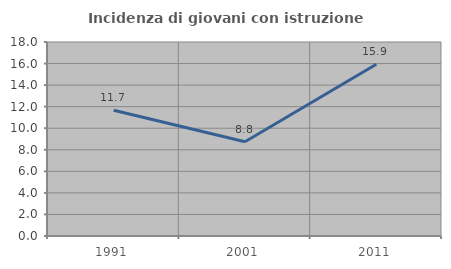
| Category | Incidenza di giovani con istruzione universitaria |
|---|---|
| 1991.0 | 11.667 |
| 2001.0 | 8.75 |
| 2011.0 | 15.942 |